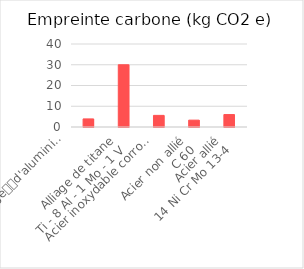
| Category | Series 0 |
|---|---|
| Alliage
d'aluminium
4032-T6
(Al Si 12,5 Mg Cu Ni) | 3.9 |
| Alliage de titane
Ti - 8 Al - 1 Mo - 1 V | 30 |
| Acier inoxydable corroyé
X6 Cr Ni Ti 18-10 | 5.6 |
| Acier non allié
C 60 | 3.3 |
| Acier allié
14 Ni Cr Mo 13-4 | 6 |